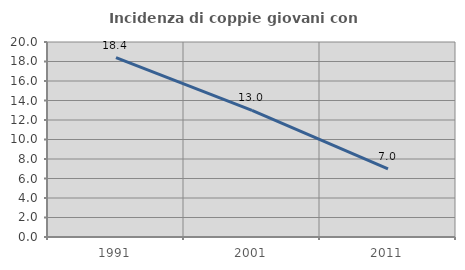
| Category | Incidenza di coppie giovani con figli |
|---|---|
| 1991.0 | 18.388 |
| 2001.0 | 12.997 |
| 2011.0 | 6.988 |